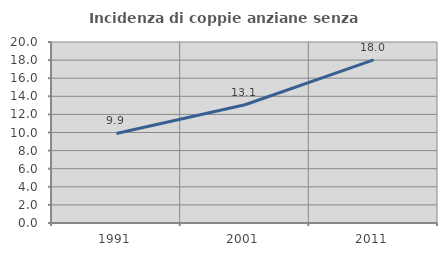
| Category | Incidenza di coppie anziane senza figli  |
|---|---|
| 1991.0 | 9.893 |
| 2001.0 | 13.068 |
| 2011.0 | 18.02 |